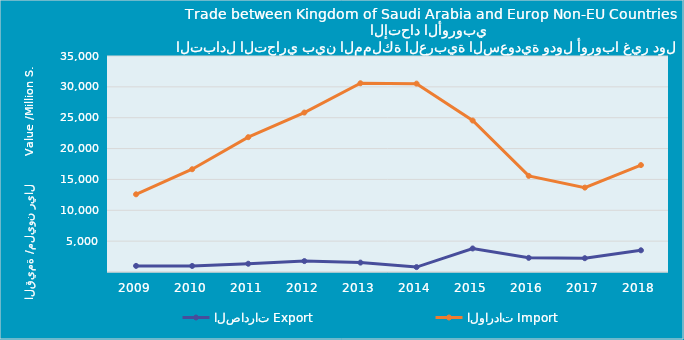
| Category | الصادرات | الواردات |
|---|---|---|
| 2009.0 | 990322081 | 12590476606 |
| 2010.0 | 977655073 | 16651954528 |
| 2011.0 | 1338033602 | 21845952326 |
| 2012.0 | 1768623879 | 25834920782 |
| 2013.0 | 1523350473 | 30583895729 |
| 2014.0 | 794931092 | 30522887482 |
| 2015.0 | 3812224092 | 24543035222 |
| 2016.0 | 2293178465 | 15576335883 |
| 2017.0 | 2236280551 | 13676715930 |
| 2018.0 | 3515093487 | 17326337006 |